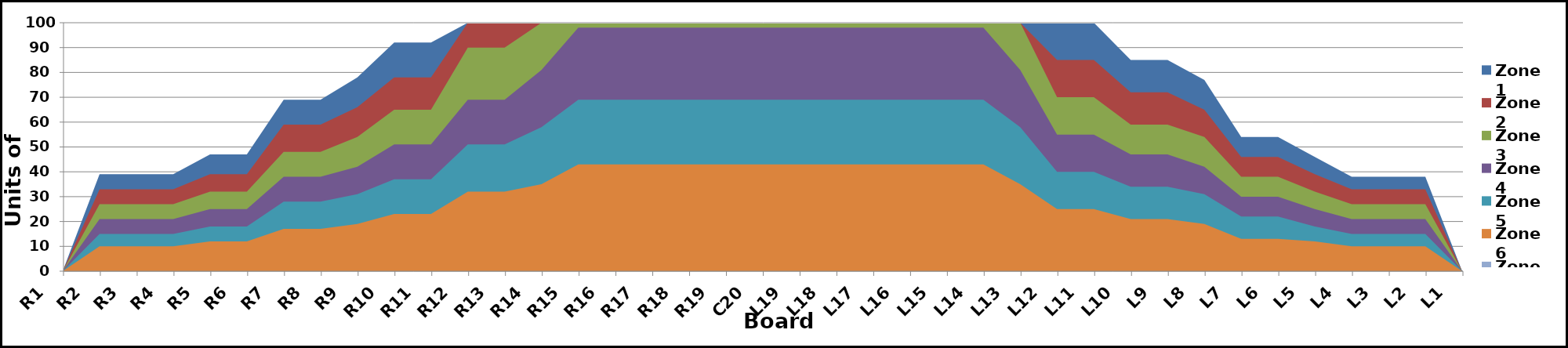
| Category | Zone 1 | Zone 2 | Zone 3 | Zone 4 | Zone 5 | Zone 6 | Zone 7 | Zone 8 |
|---|---|---|---|---|---|---|---|---|
| L1 | 0 | 0 | 0 | 0 | 0 | 0 | 0 | 0 |
| L2 | 38 | 33 | 27 | 21 | 15 | 10 | 0 | 0 |
| L3 | 38 | 33 | 27 | 21 | 15 | 10 | 0 | 0 |
| L4 | 38 | 33 | 27 | 21 | 15 | 10 | 0 | 0 |
| L5 | 46 | 39 | 32 | 25 | 18 | 12 | 0 | 0 |
| L6 | 54 | 46 | 38 | 30 | 22 | 13 | 0 | 0 |
| L7 | 54 | 46 | 38 | 30 | 22 | 13 | 0 | 0 |
| L8 | 77 | 65 | 54 | 42 | 31 | 19 | 0 | 0 |
| L9 | 85 | 72 | 59 | 47 | 34 | 21 | 0 | 0 |
| L10 | 85 | 72 | 59 | 47 | 34 | 21 | 0 | 0 |
| L11 | 100 | 85 | 70 | 55 | 40 | 25 | 0 | 0 |
| L12 | 100 | 85 | 70 | 55 | 40 | 25 | 0 | 0 |
| L13 | 100 | 100 | 100 | 81 | 58 | 35 | 0 | 0 |
| L14 | 100 | 100 | 100 | 98 | 69 | 43 | 0 | 0 |
| L15 | 100 | 100 | 100 | 98 | 69 | 43 | 0 | 0 |
| L16 | 100 | 100 | 100 | 98 | 69 | 43 | 0 | 0 |
| L17 | 100 | 100 | 100 | 98 | 69 | 43 | 0 | 0 |
| L18 | 100 | 100 | 100 | 98 | 69 | 43 | 0 | 0 |
| L19 | 100 | 100 | 100 | 98 | 69 | 43 | 0 | 0 |
| C20 | 100 | 100 | 100 | 98 | 69 | 43 | 0 | 0 |
| R19 | 100 | 100 | 100 | 98 | 69 | 43 | 0 | 0 |
| R18 | 100 | 100 | 100 | 98 | 69 | 43 | 0 | 0 |
| R17 | 100 | 100 | 100 | 98 | 69 | 43 | 0 | 0 |
| R16 | 100 | 100 | 100 | 98 | 69 | 43 | 0 | 0 |
| R15 | 100 | 100 | 100 | 98 | 69 | 43 | 0 | 0 |
| R14 | 100 | 100 | 100 | 81 | 58 | 35 | 0 | 0 |
| R13 | 100 | 100 | 90 | 69 | 51 | 32 | 0 | 0 |
| R12 | 100 | 100 | 90 | 69 | 51 | 32 | 0 | 0 |
| R11 | 92 | 78 | 65 | 51 | 37 | 23 | 0 | 0 |
| R10 | 92 | 78 | 65 | 51 | 37 | 23 | 0 | 0 |
| R9 | 78 | 66 | 54 | 42 | 31 | 19 | 0 | 0 |
| R8 | 69 | 59 | 48 | 38 | 28 | 17 | 0 | 0 |
| R7 | 69 | 59 | 48 | 38 | 28 | 17 | 0 | 0 |
| R6 | 47 | 39 | 32 | 25 | 18 | 12 | 0 | 0 |
| R5 | 47 | 39 | 32 | 25 | 18 | 12 | 0 | 0 |
| R4 | 39 | 33 | 27 | 21 | 15 | 10 | 0 | 0 |
| R3 | 39 | 33 | 27 | 21 | 15 | 10 | 0 | 0 |
| R2 | 39 | 33 | 27 | 21 | 15 | 10 | 0 | 0 |
| R1 | 0 | 0 | 0 | 0 | 0 | 0 | 0 | 0 |